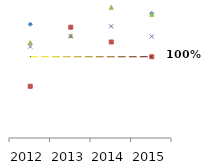
| Category | ACC Ltd Other variable cost | Ambuja Cement Other variable cost | JK Lakshmi Cement Other variable cost | Ultratech Cement Other variable cost | Baseline |
|---|---|---|---|---|---|
| 2012.0 | 1.2 | 0.818 | 1.087 | 1.062 | 1 |
| 2013.0 | 1.467 | 1.182 | 1.13 | 1.125 | 1 |
| 2014.0 | 1.333 | 1.091 | 1.304 | 1.188 | 1 |
| 2015.0 | 1.267 | 1 | 1.261 | 1.125 | 1 |